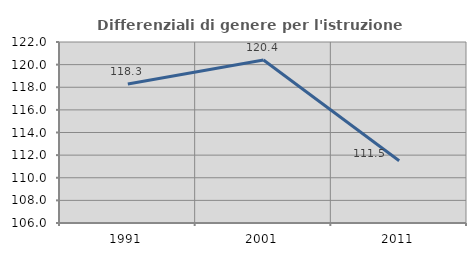
| Category | Differenziali di genere per l'istruzione superiore |
|---|---|
| 1991.0 | 118.281 |
| 2001.0 | 120.403 |
| 2011.0 | 111.507 |